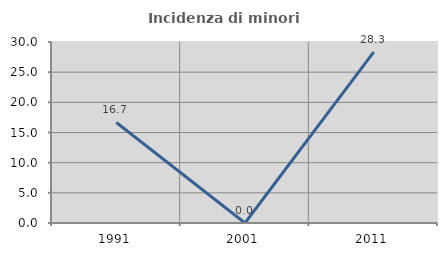
| Category | Incidenza di minori stranieri |
|---|---|
| 1991.0 | 16.667 |
| 2001.0 | 0 |
| 2011.0 | 28.333 |